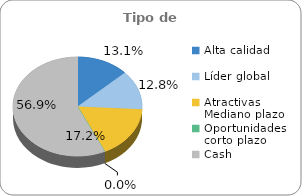
| Category | Series 0 |
|---|---|
| Alta calidad | 0.131 |
| Líder global | 0.128 |
| Atractivas Mediano plazo | 0.172 |
| Oportunidades corto plazo | 0 |
| Cash | 0.569 |